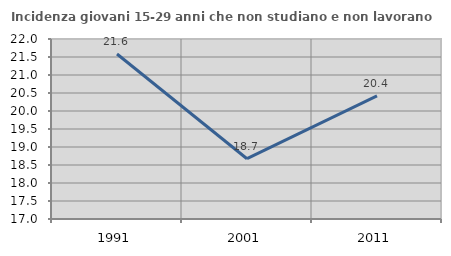
| Category | Incidenza giovani 15-29 anni che non studiano e non lavorano  |
|---|---|
| 1991.0 | 21.584 |
| 2001.0 | 18.675 |
| 2011.0 | 20.423 |